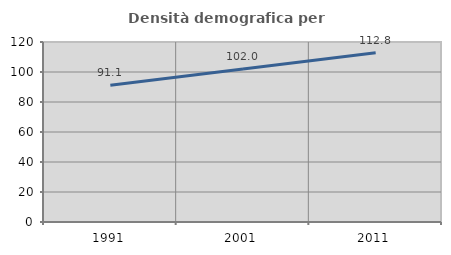
| Category | Densità demografica |
|---|---|
| 1991.0 | 91.118 |
| 2001.0 | 102.017 |
| 2011.0 | 112.803 |